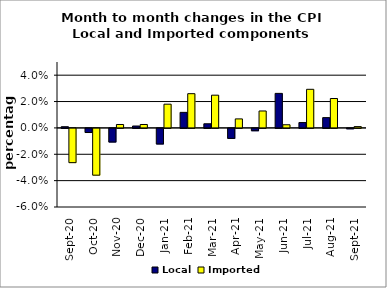
| Category | Local | Imported |
|---|---|---|
| 2020-09-01 | 0.001 | -0.026 |
| 2020-10-01 | -0.003 | -0.035 |
| 2020-11-01 | -0.01 | 0.003 |
| 2020-12-01 | 0.001 | 0.003 |
| 2021-01-01 | -0.012 | 0.018 |
| 2021-02-01 | 0.012 | 0.026 |
| 2021-03-01 | 0.003 | 0.025 |
| 2021-04-01 | -0.008 | 0.007 |
| 2021-05-01 | -0.002 | 0.013 |
| 2021-06-01 | 0.026 | 0.002 |
| 2021-07-01 | 0.004 | 0.029 |
| 2021-08-01 | 0.008 | 0.022 |
| 2021-09-01 | 0 | 0.001 |